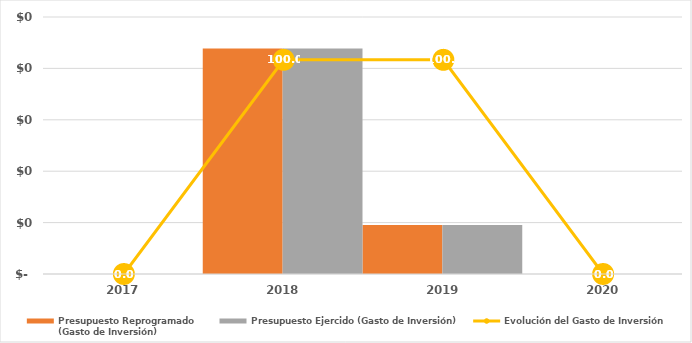
| Category | Presupuesto Reprogramado
(Gasto de Inversión) | Presupuesto Ejercido (Gasto de Inversión) |
|---|---|---|
| 2017.0 | 0 | 0 |
| 2018.0 | 21.924 | 21.924 |
| 2019.0 | 4.77 | 4.77 |
| 2020.0 | 0 | 0 |